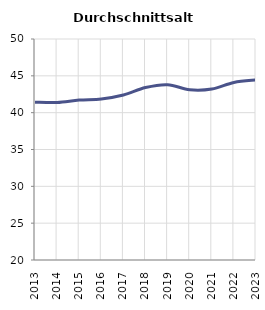
| Category | Durchschnittsalter |
|---|---|
| 2013.0 | 41.429 |
| 2014.0 | 41.383 |
| 2015.0 | 41.706 |
| 2016.0 | 41.857 |
| 2017.0 | 42.391 |
| 2018.0 | 43.415 |
| 2019.0 | 43.799 |
| 2020.0 | 43.1 |
| 2021.0 | 43.201 |
| 2022.0 | 44.1 |
| 2023.0 | 44.437 |